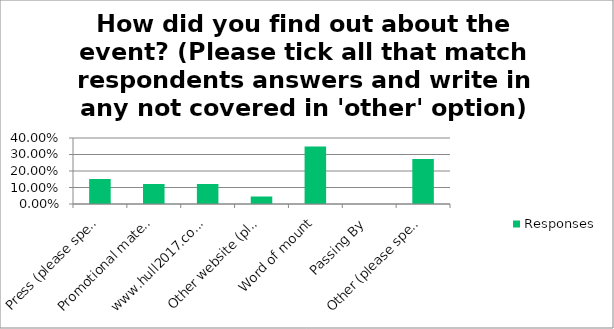
| Category | Responses |
|---|---|
| Press (please specify newspaper/magazine etc) | 0.152 |
| Promotional materials (i.e. posters, brochures etc) | 0.121 |
| www.hull2017.co.uk | 0.121 |
| Other website (please specify) | 0.046 |
| Word of mount | 0.348 |
| Passing By | 0 |
| Other (please specify) | 0.273 |